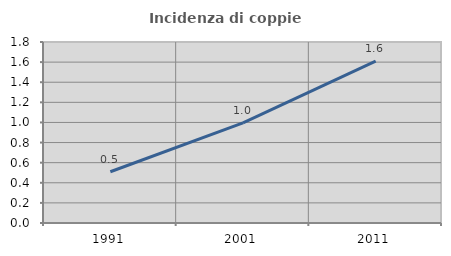
| Category | Incidenza di coppie miste |
|---|---|
| 1991.0 | 0.51 |
| 2001.0 | 0.996 |
| 2011.0 | 1.61 |